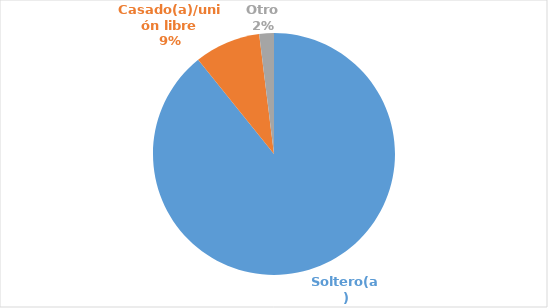
| Category | Series 0 |
|---|---|
| Soltero(a) | 0.892 |
| Casado(a)/unión libre | 0.088 |
| Otro | 0.02 |